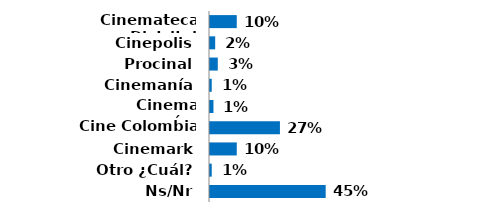
| Category | Series 0 |
|---|---|
| Cinemateca Distrital | 0.103 |
| Cinepolis | 0.02 |
| Procinal | 0.03 |
| Cinemanía | 0.007 |
| Cinema paraíso | 0.013 |
| Cine Colombia | 0.27 |
| Cinemark | 0.103 |
| Otro ¿Cuál? | 0.007 |
| Ns/Nr | 0.447 |